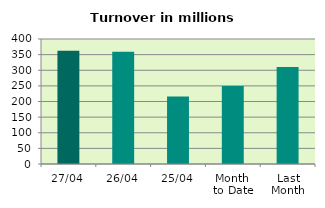
| Category | Series 0 |
|---|---|
| 27/04 | 362.089 |
| 26/04 | 359.322 |
| 25/04 | 216.278 |
| Month 
to Date | 249.692 |
| Last
Month | 310.688 |